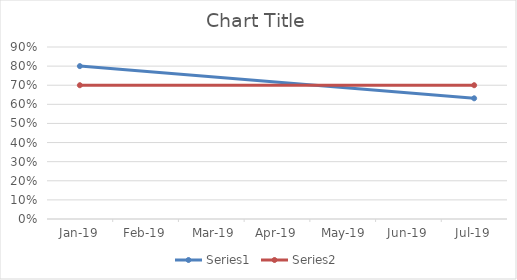
| Category | Series 0 | Series 1 |
|---|---|---|
| 2019-01-01 | 0.8 | 0.7 |
| 2019-07-01 | 0.632 | 0.7 |